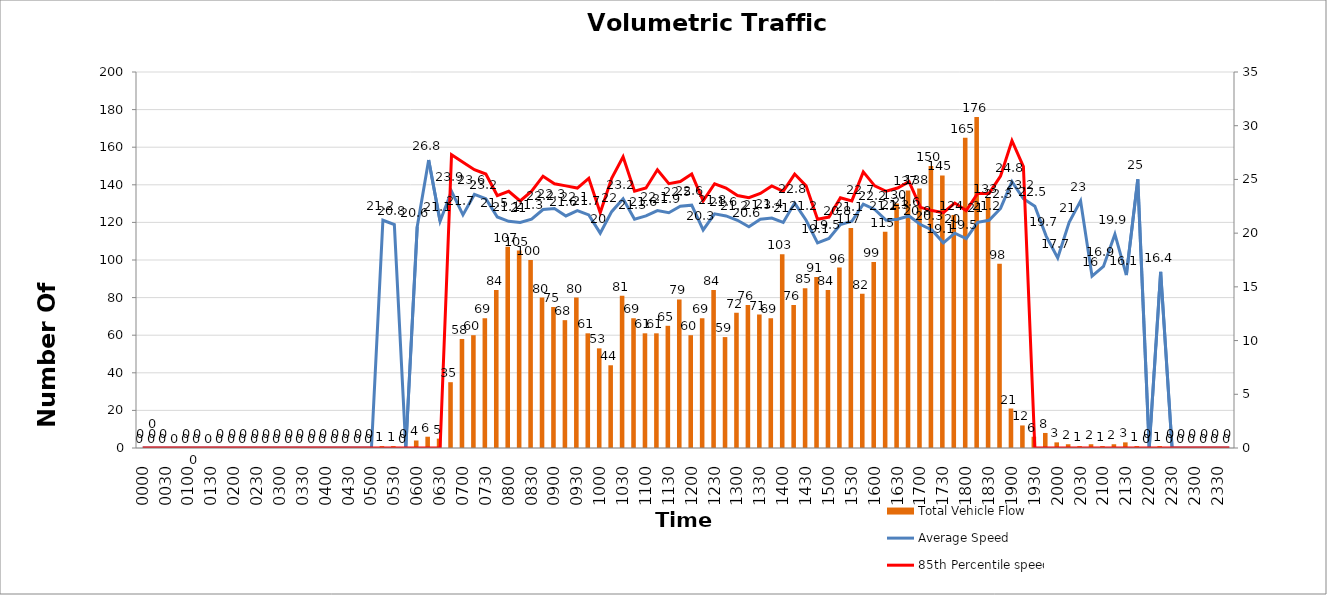
| Category | Total Vehicle Flow |
|---|---|
| 0000 | 0 |
| 0015 | 0 |
| 0030 | 0 |
| 0045 | 0 |
| 0100 | 0 |
| 0115 | 0 |
| 0130 | 0 |
| 0145 | 0 |
| 0200 | 0 |
| 0215 | 0 |
| 0230 | 0 |
| 0245 | 0 |
| 0300 | 0 |
| 0315 | 0 |
| 0330 | 0 |
| 0345 | 0 |
| 0400 | 0 |
| 0415 | 0 |
| 0430 | 0 |
| 0445 | 0 |
| 0500 | 0 |
| 0515 | 1 |
| 0530 | 1 |
| 0545 | 0 |
| 0600 | 4 |
| 0615 | 6 |
| 0630 | 5 |
| 0645 | 35 |
| 0700 | 58 |
| 0715 | 60 |
| 0730 | 69 |
| 0745 | 84 |
| 0800 | 107 |
| 0815 | 105 |
| 0830 | 100 |
| 0845 | 80 |
| 0900 | 75 |
| 0915 | 68 |
| 0930 | 80 |
| 0945 | 61 |
| 1000 | 53 |
| 1015 | 44 |
| 1030 | 81 |
| 1045 | 69 |
| 1100 | 61 |
| 1115 | 61 |
| 1130 | 65 |
| 1145 | 79 |
| 1200 | 60 |
| 1215 | 69 |
| 1230 | 84 |
| 1245 | 59 |
| 1300 | 72 |
| 1315 | 76 |
| 1330 | 71 |
| 1345 | 69 |
| 1400 | 103 |
| 1415 | 76 |
| 1430 | 85 |
| 1445 | 91 |
| 1500 | 84 |
| 1515 | 96 |
| 1530 | 117 |
| 1545 | 82 |
| 1600 | 99 |
| 1615 | 115 |
| 1630 | 130 |
| 1645 | 137 |
| 1700 | 138 |
| 1715 | 150 |
| 1730 | 145 |
| 1745 | 124 |
| 1800 | 165 |
| 1815 | 176 |
| 1830 | 133 |
| 1845 | 98 |
| 1900 | 21 |
| 1915 | 12 |
| 1930 | 6 |
| 1945 | 8 |
| 2000 | 3 |
| 2015 | 2 |
| 2030 | 1 |
| 2045 | 2 |
| 2100 | 1 |
| 2115 | 2 |
| 2130 | 3 |
| 2145 | 1 |
| 2200 | 0 |
| 2215 | 1 |
| 2230 | 0 |
| 2245 | 0 |
| 2300 | 0 |
| 2315 | 0 |
| 2330 | 0 |
| 2345 | 0 |